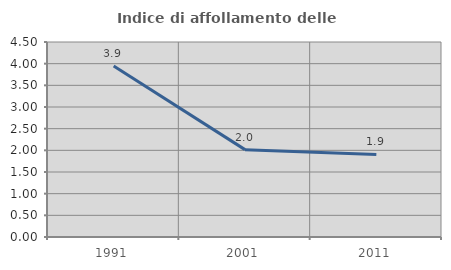
| Category | Indice di affollamento delle abitazioni  |
|---|---|
| 1991.0 | 3.947 |
| 2001.0 | 2.016 |
| 2011.0 | 1.905 |